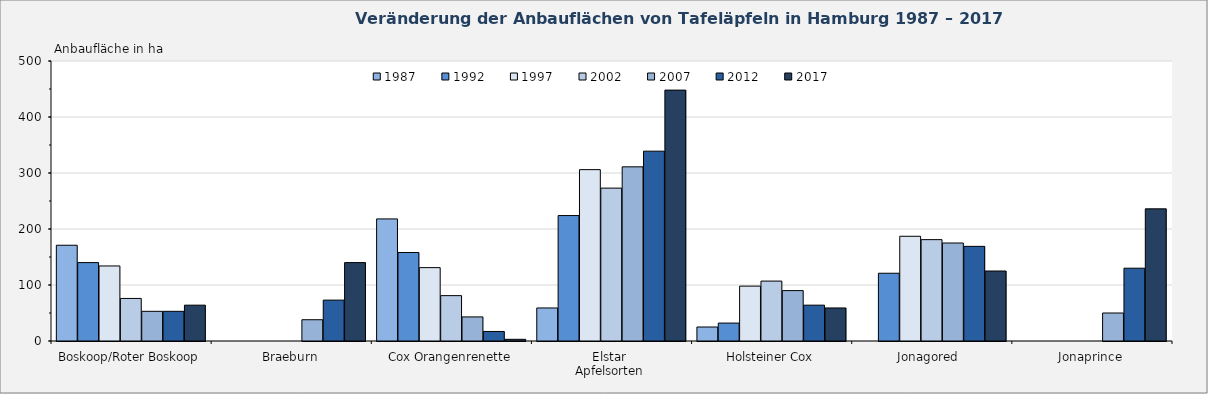
| Category | 1987 | 1992 | 1997 | 2002 | 2007 | 2012 | 2017 |
|---|---|---|---|---|---|---|---|
| Boskoop/Roter Boskoop | 171 | 140 | 134 | 76 | 53 | 53 | 64 |
| Braeburn | 0 | 0 | 0 | 0 | 38 | 73 | 140 |
| Cox Orangenrenette | 218 | 158 | 131 | 81 | 43 | 17 | 3 |
| Elstar | 59 | 224 | 306 | 273 | 311 | 339 | 448 |
| Holsteiner Cox | 25 | 32 | 98 | 107 | 90 | 64 | 59 |
| Jonagored  | 0 | 121 | 187 | 181 | 175 | 169 | 125 |
| Jonaprince | 0 | 0 | 0 | 0 | 50 | 130 | 236 |